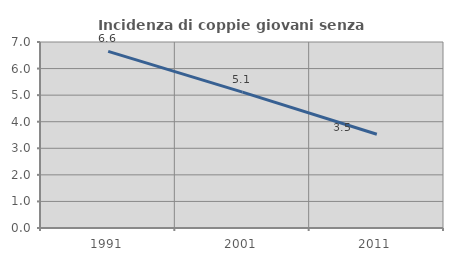
| Category | Incidenza di coppie giovani senza figli |
|---|---|
| 1991.0 | 6.648 |
| 2001.0 | 5.112 |
| 2011.0 | 3.529 |